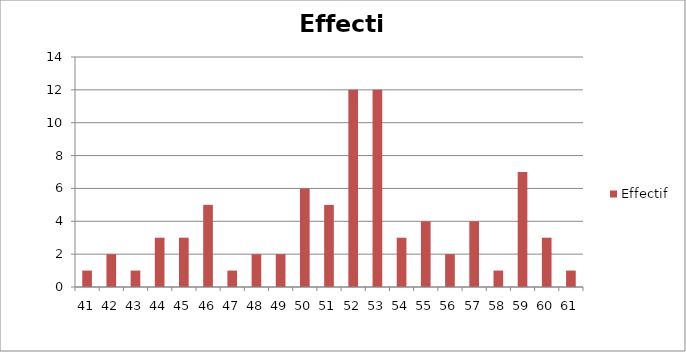
| Category | Effectif |
|---|---|
| 41.0 | 1 |
| 42.0 | 2 |
| 43.0 | 1 |
| 44.0 | 3 |
| 45.0 | 3 |
| 46.0 | 5 |
| 47.0 | 1 |
| 48.0 | 2 |
| 49.0 | 2 |
| 50.0 | 6 |
| 51.0 | 5 |
| 52.0 | 12 |
| 53.0 | 12 |
| 54.0 | 3 |
| 55.0 | 4 |
| 56.0 | 2 |
| 57.0 | 4 |
| 58.0 | 1 |
| 59.0 | 7 |
| 60.0 | 3 |
| 61.0 | 1 |